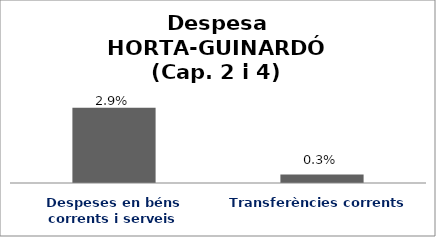
| Category | Series 0 |
|---|---|
| Despeses en béns corrents i serveis | 0.029 |
| Transferències corrents | 0.003 |